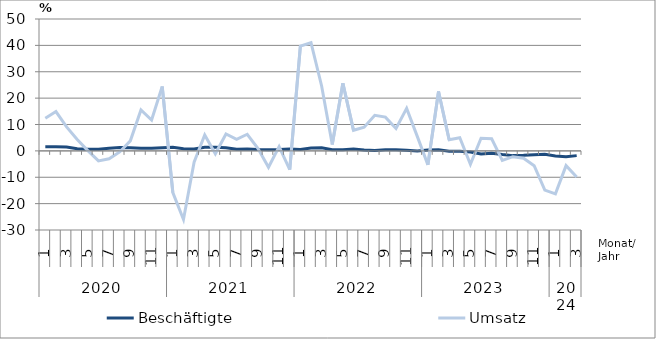
| Category | Beschäftigte | Umsatz |
|---|---|---|
| 0 | 1.6 | 12.4 |
| 1 | 1.6 | 14.9 |
| 2 | 1.5 | 9.1 |
| 3 | 0.8 | 4.3 |
| 4 | 0.6 | 0.1 |
| 5 | 0.6 | -3.8 |
| 6 | 1 | -3 |
| 7 | 1.3 | -0.4 |
| 8 | 1.2 | 3.8 |
| 9 | 1 | 15.5 |
| 10 | 1 | 11.7 |
| 11 | 1.2 | 24.4 |
| 12 | 1.4 | -15.8 |
| 13 | 0.8 | -26 |
| 14 | 0.7 | -4.3 |
| 15 | 1.4 | 6 |
| 16 | 1.4 | -1.1 |
| 17 | 1.2 | 6.4 |
| 18 | 0.6 | 4.4 |
| 19 | 0.7 | 6.3 |
| 20 | 0.5 | 1 |
| 21 | 0.4 | -6.2 |
| 22 | 0.5 | 1.6 |
| 23 | 0.7 | -7.1 |
| 24 | 0.5 | 39.7 |
| 25 | 1.1 | 41 |
| 26 | 1.2 | 24.6 |
| 27 | 0.4 | 2.4 |
| 28 | 0.4 | 25.6 |
| 29 | 0.7 | 7.8 |
| 30 | 0.3 | 9 |
| 31 | 0.1 | 13.5 |
| 32 | 0.4 | 12.8 |
| 33 | 0.4 | 8.5 |
| 34 | 0.2 | 16.1 |
| 35 | 0 | 5.5 |
| 36 | 0.3 | -5.3 |
| 37 | 0.4 | 22.5 |
| 38 | -0.1 | 4.2 |
| 39 | -0.1 | 5 |
| 40 | -0.4 | -5.1 |
| 41 | -1.2 | 4.8 |
| 42 | -0.9 | 4.6 |
| 43 | -1.4 | -3.6 |
| 44 | -1.8 | -2.2 |
| 45 | -1.7 | -2.8 |
| 46 | -1.5 | -5.6 |
| 47 | -1.3 | -14.9 |
| 48 | -1.9 | -16.3 |
| 49 | -2.2 | -5.6 |
| 50 | -1.8 | -9.9 |